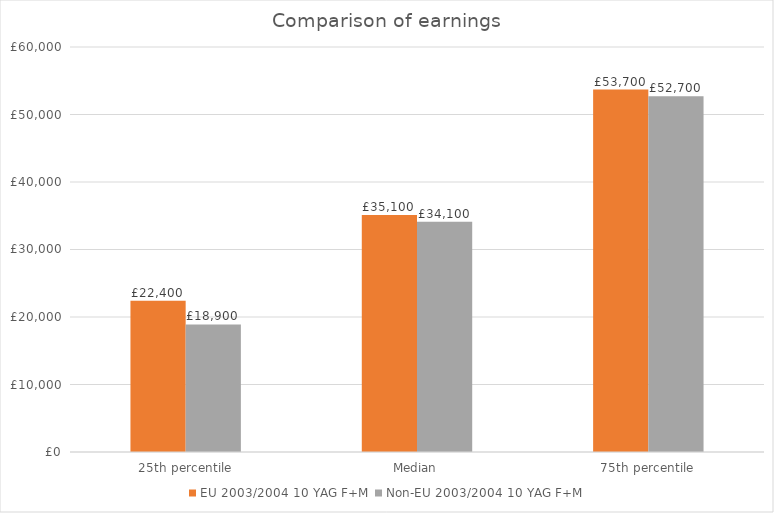
| Category | Series 0 | EU | Non-EU |
|---|---|---|---|
| 25th percentile |  | 22400 | 18900 |
| Median |  | 35100 | 34100 |
| 75th percentile |  | 53700 | 52700 |